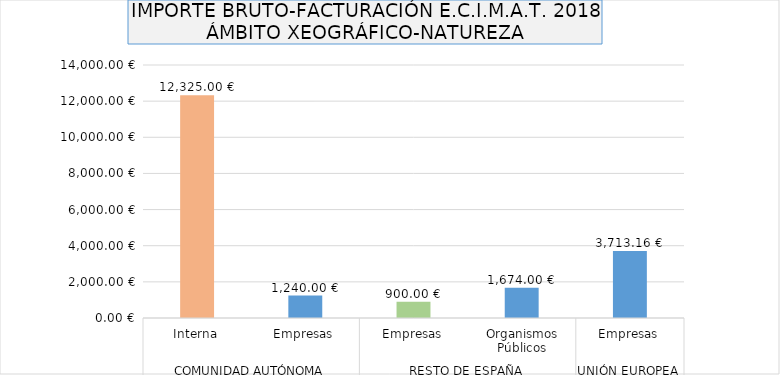
| Category | Series 0 |
|---|---|
| 0 | 12325 |
| 1 | 1240 |
| 2 | 900 |
| 3 | 1674 |
| 4 | 3713.16 |